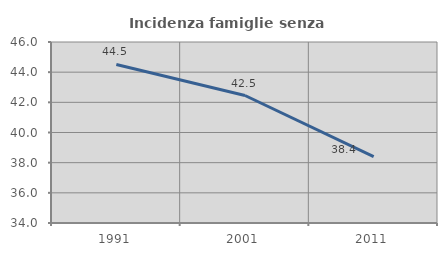
| Category | Incidenza famiglie senza nuclei |
|---|---|
| 1991.0 | 44.512 |
| 2001.0 | 42.453 |
| 2011.0 | 38.403 |